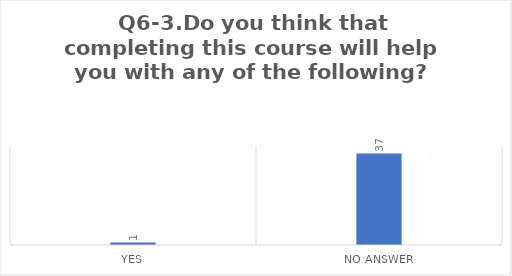
| Category | Q6-3.Do you think that completing this course will help you with any of the following?


Start your own business |
|---|---|
| Yes | 1 |
| No Answer | 37 |